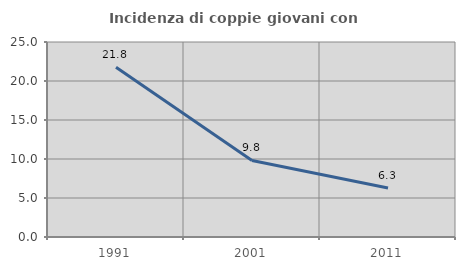
| Category | Incidenza di coppie giovani con figli |
|---|---|
| 1991.0 | 21.756 |
| 2001.0 | 9.818 |
| 2011.0 | 6.273 |